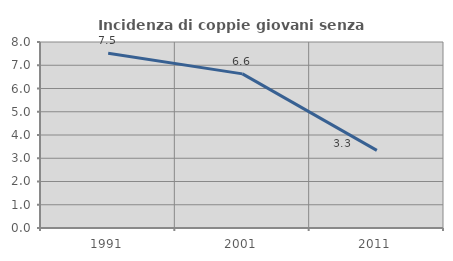
| Category | Incidenza di coppie giovani senza figli |
|---|---|
| 1991.0 | 7.516 |
| 2001.0 | 6.629 |
| 2011.0 | 3.34 |